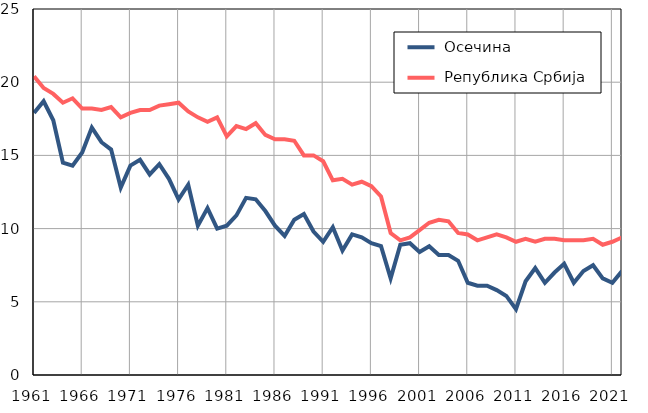
| Category |  Осечина |  Република Србија |
|---|---|---|
| 1961.0 | 17.9 | 20.4 |
| 1962.0 | 18.7 | 19.6 |
| 1963.0 | 17.4 | 19.2 |
| 1964.0 | 14.5 | 18.6 |
| 1965.0 | 14.3 | 18.9 |
| 1966.0 | 15.2 | 18.2 |
| 1967.0 | 16.9 | 18.2 |
| 1968.0 | 15.9 | 18.1 |
| 1969.0 | 15.4 | 18.3 |
| 1970.0 | 12.8 | 17.6 |
| 1971.0 | 14.3 | 17.9 |
| 1972.0 | 14.7 | 18.1 |
| 1973.0 | 13.7 | 18.1 |
| 1974.0 | 14.4 | 18.4 |
| 1975.0 | 13.4 | 18.5 |
| 1976.0 | 12 | 18.6 |
| 1977.0 | 13 | 18 |
| 1978.0 | 10.2 | 17.6 |
| 1979.0 | 11.4 | 17.3 |
| 1980.0 | 10 | 17.6 |
| 1981.0 | 10.2 | 16.3 |
| 1982.0 | 10.9 | 17 |
| 1983.0 | 12.1 | 16.8 |
| 1984.0 | 12 | 17.2 |
| 1985.0 | 11.2 | 16.4 |
| 1986.0 | 10.2 | 16.1 |
| 1987.0 | 9.5 | 16.1 |
| 1988.0 | 10.6 | 16 |
| 1989.0 | 11 | 15 |
| 1990.0 | 9.8 | 15 |
| 1991.0 | 9.1 | 14.6 |
| 1992.0 | 10.1 | 13.3 |
| 1993.0 | 8.5 | 13.4 |
| 1994.0 | 9.6 | 13 |
| 1995.0 | 9.4 | 13.2 |
| 1996.0 | 9 | 12.9 |
| 1997.0 | 8.8 | 12.2 |
| 1998.0 | 6.6 | 9.7 |
| 1999.0 | 8.9 | 9.2 |
| 2000.0 | 9 | 9.4 |
| 2001.0 | 8.4 | 9.9 |
| 2002.0 | 8.8 | 10.4 |
| 2003.0 | 8.2 | 10.6 |
| 2004.0 | 8.2 | 10.5 |
| 2005.0 | 7.8 | 9.7 |
| 2006.0 | 6.3 | 9.6 |
| 2007.0 | 6.1 | 9.2 |
| 2008.0 | 6.1 | 9.4 |
| 2009.0 | 5.8 | 9.6 |
| 2010.0 | 5.4 | 9.4 |
| 2011.0 | 4.5 | 9.1 |
| 2012.0 | 6.4 | 9.3 |
| 2013.0 | 7.3 | 9.1 |
| 2014.0 | 6.3 | 9.3 |
| 2015.0 | 7 | 9.3 |
| 2016.0 | 7.6 | 9.2 |
| 2017.0 | 6.3 | 9.2 |
| 2018.0 | 7.1 | 9.2 |
| 2019.0 | 7.5 | 9.3 |
| 2020.0 | 6.6 | 8.9 |
| 2021.0 | 6.3 | 9.1 |
| 2022.0 | 7.1 | 9.4 |